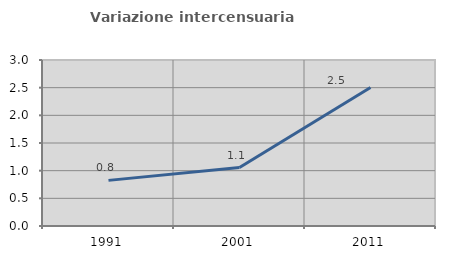
| Category | Variazione intercensuaria annua |
|---|---|
| 1991.0 | 0.825 |
| 2001.0 | 1.056 |
| 2011.0 | 2.501 |